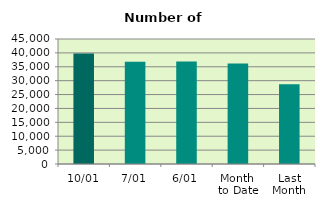
| Category | Series 0 |
|---|---|
| 10/01 | 39754 |
| 7/01 | 36780 |
| 6/01 | 36910 |
| Month 
to Date | 36199.667 |
| Last
Month | 28724.435 |